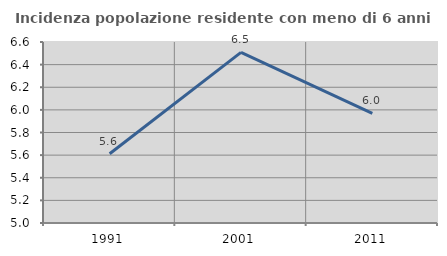
| Category | Incidenza popolazione residente con meno di 6 anni |
|---|---|
| 1991.0 | 5.612 |
| 2001.0 | 6.508 |
| 2011.0 | 5.968 |